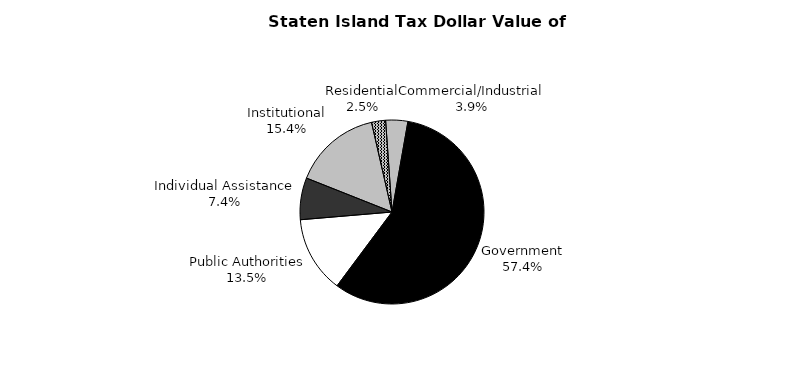
| Category | Series 0 |
|---|---|
| Government | 391081029 |
| Public Authorities | 91795152 |
| Individual Assistance | 50073689 |
| Institutional | 105017076 |
| Residential | 16820048 |
| Commercial/Industrial | 26475035 |